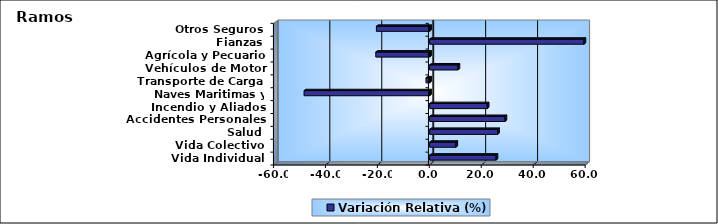
| Category | Variación Relativa (%) |
|---|---|
| Vida Individual | 25.593 |
| Vida Colectivo | 10.108 |
| Salud | 26.193 |
| Accidentes Personales | 29.036 |
| Incendio y Aliados | 22.195 |
| Naves Maritimas y Aéreas | -48.359 |
| Transporte de Carga | -1.402 |
| Vehículos de Motor | 10.934 |
| Agrícola y Pecuario | -20.73 |
| Fianzas | 59.443 |
| Otros Seguros | -20.492 |